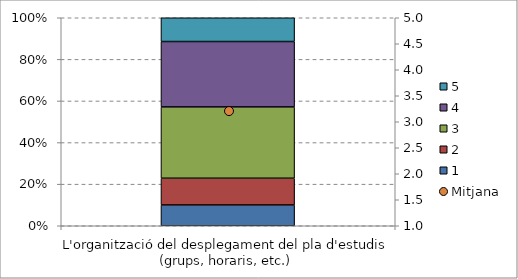
| Category | 1 | 2 | 3 | 4 | 5 |
|---|---|---|---|---|---|
| L'organització del desplegament del pla d'estudis (grups, horaris, etc.) | 7 | 9 | 24 | 22 | 8 |